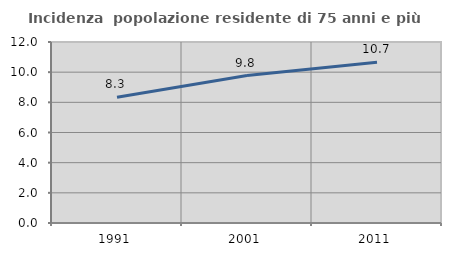
| Category | Incidenza  popolazione residente di 75 anni e più |
|---|---|
| 1991.0 | 8.344 |
| 2001.0 | 9.775 |
| 2011.0 | 10.652 |